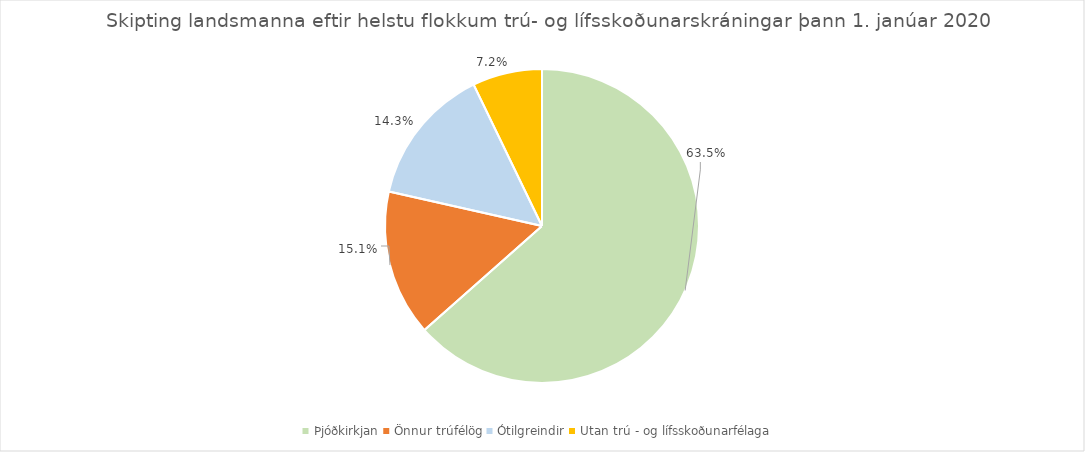
| Category | Series 0 |
|---|---|
| Þjóðkirkjan | 0.635 |
| Önnur trúfélög | 0.151 |
| Ótilgreindir | 0.143 |
| Utan trú - og lífsskoðunarfélaga | 0.072 |